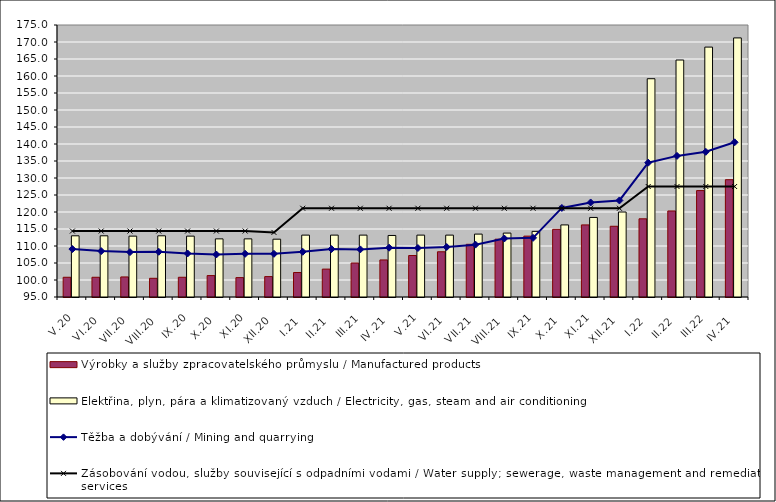
| Category | Výrobky a služby zpracovatelského průmyslu / Manufactured products | Elektřina, plyn, pára a klimatizovaný vzduch / Electricity, gas, steam and air conditioning |
|---|---|---|
| V.20 | 100.8 | 113 |
| VI.20 | 100.8 | 113 |
| VII.20 | 100.9 | 112.9 |
| VIII.20 | 100.5 | 113 |
| IX.20 | 100.8 | 112.9 |
| X.20 | 101.3 | 112.1 |
| XI.20 | 100.7 | 112.1 |
| XII.20 | 101 | 112 |
| I.21 | 102.2 | 113.2 |
| II.21 | 103.2 | 113.2 |
| III.21 | 105 | 113.2 |
| IV.21 | 105.9 | 113.1 |
| V.21 | 107.2 | 113.2 |
| VI.21 | 108.3 | 113.2 |
| VII.21 | 110.5 | 113.5 |
| VIII.21 | 112 | 113.8 |
| IX.21 | 112.9 | 114.3 |
| X.21 | 114.9 | 116.2 |
| XI.21 | 116.2 | 118.4 |
| XII.21 | 115.8 | 120 |
| I.22 | 118 | 159.2 |
| II.22 | 120.3 | 164.7 |
| III.22 | 126.3 | 168.5 |
| IV.21 | 129.5 | 171.2 |